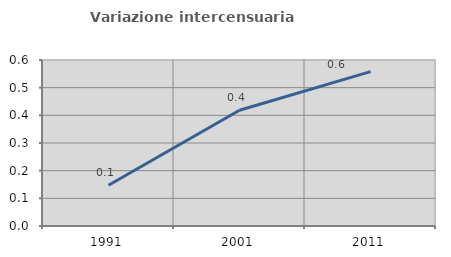
| Category | Variazione intercensuaria annua |
|---|---|
| 1991.0 | 0.147 |
| 2001.0 | 0.418 |
| 2011.0 | 0.558 |